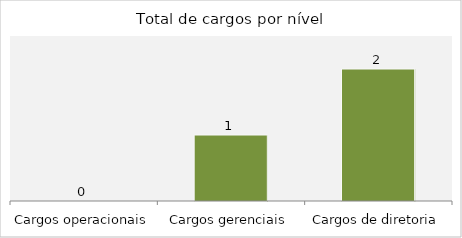
| Category | Series 0 |
|---|---|
| Cargos operacionais | 0 |
| Cargos gerenciais | 1 |
| Cargos de diretoria | 2 |